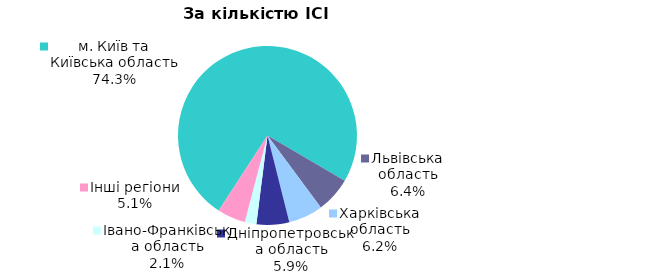
| Category | Series 0 |
|---|---|
| м. Київ та Київська область | 0.743 |
| Львівська область | 0.064 |
| Харківська область | 0.062 |
| Дніпропетровська область | 0.059 |
| Iвано-Франкiвська область | 0.021 |
| Інші регіони | 0.051 |